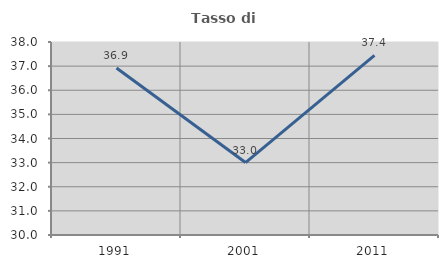
| Category | Tasso di occupazione   |
|---|---|
| 1991.0 | 36.921 |
| 2001.0 | 33.002 |
| 2011.0 | 37.442 |